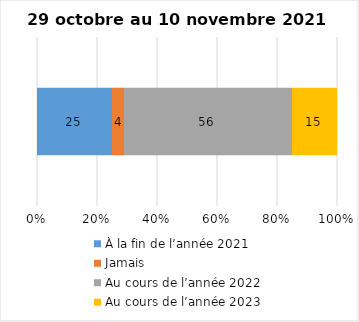
| Category | À la fin de l’année 2021 | Jamais | Au cours de l’année 2022 | Au cours de l’année 2023 |
|---|---|---|---|---|
| 0 | 25 | 4 | 56 | 15 |